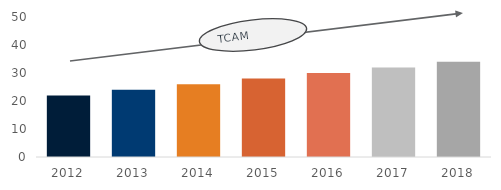
| Category | Series 0 |
|---|---|
| 2012.0 | 22 |
| 2013.0 | 24 |
| 2014.0 | 26 |
| 2015.0 | 28 |
| 2016.0 | 30 |
| 2017.0 | 32 |
| 2018.0 | 34 |